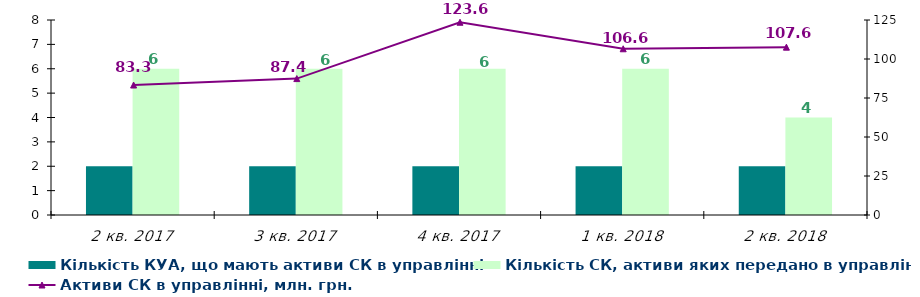
| Category | Кількість КУА, що мають активи СК в управлінні | Кількість СК, активи яких передано в управління |
|---|---|---|
| 2 кв. 2017 | 2 | 6 |
| 3 кв. 2017 | 2 | 6 |
| 4 кв. 2017 | 2 | 6 |
| 1 кв. 2018 | 2 | 6 |
| 2 кв. 2018 | 2 | 4 |